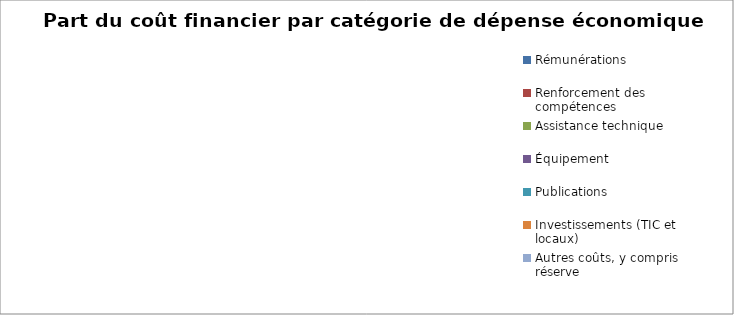
| Category | Total |
|---|---|
| Rémunérations | 0 |
| Renforcement des compétences | 0 |
| Assistance technique | 0 |
| Équipement | 0 |
| Publications | 0 |
| Investissements (TIC et locaux) | 0 |
| Autres coûts, y compris réserve | 0 |